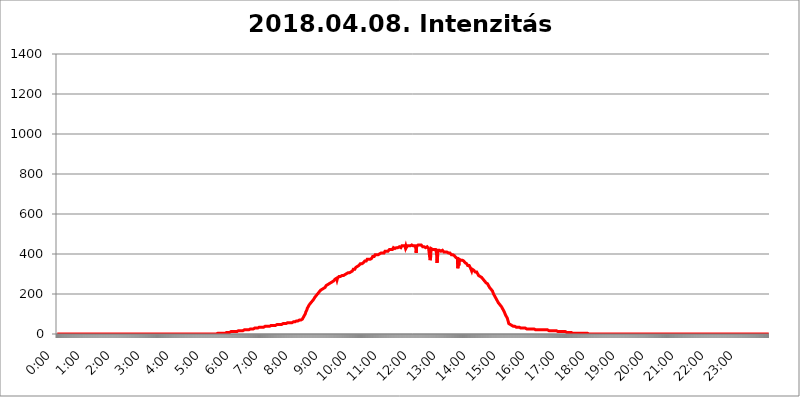
| Category | 2018.04.08. Intenzitás [W/m^2] |
|---|---|
| 0.0 | 0 |
| 0.0006944444444444445 | 0 |
| 0.001388888888888889 | 0 |
| 0.0020833333333333333 | 0 |
| 0.002777777777777778 | 0 |
| 0.003472222222222222 | 0 |
| 0.004166666666666667 | 0 |
| 0.004861111111111111 | 0 |
| 0.005555555555555556 | 0 |
| 0.0062499999999999995 | 0 |
| 0.006944444444444444 | 0 |
| 0.007638888888888889 | 0 |
| 0.008333333333333333 | 0 |
| 0.009027777777777779 | 0 |
| 0.009722222222222222 | 0 |
| 0.010416666666666666 | 0 |
| 0.011111111111111112 | 0 |
| 0.011805555555555555 | 0 |
| 0.012499999999999999 | 0 |
| 0.013194444444444444 | 0 |
| 0.013888888888888888 | 0 |
| 0.014583333333333332 | 0 |
| 0.015277777777777777 | 0 |
| 0.015972222222222224 | 0 |
| 0.016666666666666666 | 0 |
| 0.017361111111111112 | 0 |
| 0.018055555555555557 | 0 |
| 0.01875 | 0 |
| 0.019444444444444445 | 0 |
| 0.02013888888888889 | 0 |
| 0.020833333333333332 | 0 |
| 0.02152777777777778 | 0 |
| 0.022222222222222223 | 0 |
| 0.02291666666666667 | 0 |
| 0.02361111111111111 | 0 |
| 0.024305555555555556 | 0 |
| 0.024999999999999998 | 0 |
| 0.025694444444444447 | 0 |
| 0.02638888888888889 | 0 |
| 0.027083333333333334 | 0 |
| 0.027777777777777776 | 0 |
| 0.02847222222222222 | 0 |
| 0.029166666666666664 | 0 |
| 0.029861111111111113 | 0 |
| 0.030555555555555555 | 0 |
| 0.03125 | 0 |
| 0.03194444444444445 | 0 |
| 0.03263888888888889 | 0 |
| 0.03333333333333333 | 0 |
| 0.034027777777777775 | 0 |
| 0.034722222222222224 | 0 |
| 0.035416666666666666 | 0 |
| 0.036111111111111115 | 0 |
| 0.03680555555555556 | 0 |
| 0.0375 | 0 |
| 0.03819444444444444 | 0 |
| 0.03888888888888889 | 0 |
| 0.03958333333333333 | 0 |
| 0.04027777777777778 | 0 |
| 0.04097222222222222 | 0 |
| 0.041666666666666664 | 0 |
| 0.042361111111111106 | 0 |
| 0.04305555555555556 | 0 |
| 0.043750000000000004 | 0 |
| 0.044444444444444446 | 0 |
| 0.04513888888888889 | 0 |
| 0.04583333333333334 | 0 |
| 0.04652777777777778 | 0 |
| 0.04722222222222222 | 0 |
| 0.04791666666666666 | 0 |
| 0.04861111111111111 | 0 |
| 0.049305555555555554 | 0 |
| 0.049999999999999996 | 0 |
| 0.05069444444444445 | 0 |
| 0.051388888888888894 | 0 |
| 0.052083333333333336 | 0 |
| 0.05277777777777778 | 0 |
| 0.05347222222222222 | 0 |
| 0.05416666666666667 | 0 |
| 0.05486111111111111 | 0 |
| 0.05555555555555555 | 0 |
| 0.05625 | 0 |
| 0.05694444444444444 | 0 |
| 0.057638888888888885 | 0 |
| 0.05833333333333333 | 0 |
| 0.05902777777777778 | 0 |
| 0.059722222222222225 | 0 |
| 0.06041666666666667 | 0 |
| 0.061111111111111116 | 0 |
| 0.06180555555555556 | 0 |
| 0.0625 | 0 |
| 0.06319444444444444 | 0 |
| 0.06388888888888888 | 0 |
| 0.06458333333333334 | 0 |
| 0.06527777777777778 | 0 |
| 0.06597222222222222 | 0 |
| 0.06666666666666667 | 0 |
| 0.06736111111111111 | 0 |
| 0.06805555555555555 | 0 |
| 0.06874999999999999 | 0 |
| 0.06944444444444443 | 0 |
| 0.07013888888888889 | 0 |
| 0.07083333333333333 | 0 |
| 0.07152777777777779 | 0 |
| 0.07222222222222223 | 0 |
| 0.07291666666666667 | 0 |
| 0.07361111111111111 | 0 |
| 0.07430555555555556 | 0 |
| 0.075 | 0 |
| 0.07569444444444444 | 0 |
| 0.0763888888888889 | 0 |
| 0.07708333333333334 | 0 |
| 0.07777777777777778 | 0 |
| 0.07847222222222222 | 0 |
| 0.07916666666666666 | 0 |
| 0.0798611111111111 | 0 |
| 0.08055555555555556 | 0 |
| 0.08125 | 0 |
| 0.08194444444444444 | 0 |
| 0.08263888888888889 | 0 |
| 0.08333333333333333 | 0 |
| 0.08402777777777777 | 0 |
| 0.08472222222222221 | 0 |
| 0.08541666666666665 | 0 |
| 0.08611111111111112 | 0 |
| 0.08680555555555557 | 0 |
| 0.08750000000000001 | 0 |
| 0.08819444444444445 | 0 |
| 0.08888888888888889 | 0 |
| 0.08958333333333333 | 0 |
| 0.09027777777777778 | 0 |
| 0.09097222222222222 | 0 |
| 0.09166666666666667 | 0 |
| 0.09236111111111112 | 0 |
| 0.09305555555555556 | 0 |
| 0.09375 | 0 |
| 0.09444444444444444 | 0 |
| 0.09513888888888888 | 0 |
| 0.09583333333333333 | 0 |
| 0.09652777777777777 | 0 |
| 0.09722222222222222 | 0 |
| 0.09791666666666667 | 0 |
| 0.09861111111111111 | 0 |
| 0.09930555555555555 | 0 |
| 0.09999999999999999 | 0 |
| 0.10069444444444443 | 0 |
| 0.1013888888888889 | 0 |
| 0.10208333333333335 | 0 |
| 0.10277777777777779 | 0 |
| 0.10347222222222223 | 0 |
| 0.10416666666666667 | 0 |
| 0.10486111111111111 | 0 |
| 0.10555555555555556 | 0 |
| 0.10625 | 0 |
| 0.10694444444444444 | 0 |
| 0.1076388888888889 | 0 |
| 0.10833333333333334 | 0 |
| 0.10902777777777778 | 0 |
| 0.10972222222222222 | 0 |
| 0.1111111111111111 | 0 |
| 0.11180555555555556 | 0 |
| 0.11180555555555556 | 0 |
| 0.1125 | 0 |
| 0.11319444444444444 | 0 |
| 0.11388888888888889 | 0 |
| 0.11458333333333333 | 0 |
| 0.11527777777777777 | 0 |
| 0.11597222222222221 | 0 |
| 0.11666666666666665 | 0 |
| 0.1173611111111111 | 0 |
| 0.11805555555555557 | 0 |
| 0.11944444444444445 | 0 |
| 0.12013888888888889 | 0 |
| 0.12083333333333333 | 0 |
| 0.12152777777777778 | 0 |
| 0.12222222222222223 | 0 |
| 0.12291666666666667 | 0 |
| 0.12291666666666667 | 0 |
| 0.12361111111111112 | 0 |
| 0.12430555555555556 | 0 |
| 0.125 | 0 |
| 0.12569444444444444 | 0 |
| 0.12638888888888888 | 0 |
| 0.12708333333333333 | 0 |
| 0.16875 | 0 |
| 0.12847222222222224 | 0 |
| 0.12916666666666668 | 0 |
| 0.12986111111111112 | 0 |
| 0.13055555555555556 | 0 |
| 0.13125 | 0 |
| 0.13194444444444445 | 0 |
| 0.1326388888888889 | 0 |
| 0.13333333333333333 | 0 |
| 0.13402777777777777 | 0 |
| 0.13402777777777777 | 0 |
| 0.13472222222222222 | 0 |
| 0.13541666666666666 | 0 |
| 0.1361111111111111 | 0 |
| 0.13749999999999998 | 0 |
| 0.13819444444444443 | 0 |
| 0.1388888888888889 | 0 |
| 0.13958333333333334 | 0 |
| 0.14027777777777778 | 0 |
| 0.14097222222222222 | 0 |
| 0.14166666666666666 | 0 |
| 0.1423611111111111 | 0 |
| 0.14305555555555557 | 0 |
| 0.14375000000000002 | 0 |
| 0.14444444444444446 | 0 |
| 0.1451388888888889 | 0 |
| 0.1451388888888889 | 0 |
| 0.14652777777777778 | 0 |
| 0.14722222222222223 | 0 |
| 0.14791666666666667 | 0 |
| 0.1486111111111111 | 0 |
| 0.14930555555555555 | 0 |
| 0.15 | 0 |
| 0.15069444444444444 | 0 |
| 0.15138888888888888 | 0 |
| 0.15208333333333332 | 0 |
| 0.15277777777777776 | 0 |
| 0.15347222222222223 | 0 |
| 0.15416666666666667 | 0 |
| 0.15486111111111112 | 0 |
| 0.15555555555555556 | 0 |
| 0.15625 | 0 |
| 0.15694444444444444 | 0 |
| 0.15763888888888888 | 0 |
| 0.15833333333333333 | 0 |
| 0.15902777777777777 | 0 |
| 0.15972222222222224 | 0 |
| 0.16041666666666668 | 0 |
| 0.16111111111111112 | 0 |
| 0.16180555555555556 | 0 |
| 0.1625 | 0 |
| 0.16319444444444445 | 0 |
| 0.1638888888888889 | 0 |
| 0.16458333333333333 | 0 |
| 0.16527777777777777 | 0 |
| 0.16597222222222222 | 0 |
| 0.16666666666666666 | 0 |
| 0.1673611111111111 | 0 |
| 0.16805555555555554 | 0 |
| 0.16874999999999998 | 0 |
| 0.16944444444444443 | 0 |
| 0.17013888888888887 | 0 |
| 0.1708333333333333 | 0 |
| 0.17152777777777775 | 0 |
| 0.17222222222222225 | 0 |
| 0.1729166666666667 | 0 |
| 0.17361111111111113 | 0 |
| 0.17430555555555557 | 0 |
| 0.17500000000000002 | 0 |
| 0.17569444444444446 | 0 |
| 0.1763888888888889 | 0 |
| 0.17708333333333334 | 0 |
| 0.17777777777777778 | 0 |
| 0.17847222222222223 | 0 |
| 0.17916666666666667 | 0 |
| 0.1798611111111111 | 0 |
| 0.18055555555555555 | 0 |
| 0.18125 | 0 |
| 0.18194444444444444 | 0 |
| 0.1826388888888889 | 0 |
| 0.18333333333333335 | 0 |
| 0.1840277777777778 | 0 |
| 0.18472222222222223 | 0 |
| 0.18541666666666667 | 0 |
| 0.18611111111111112 | 0 |
| 0.18680555555555556 | 0 |
| 0.1875 | 0 |
| 0.18819444444444444 | 0 |
| 0.18888888888888888 | 0 |
| 0.18958333333333333 | 0 |
| 0.19027777777777777 | 0 |
| 0.1909722222222222 | 0 |
| 0.19166666666666665 | 0 |
| 0.19236111111111112 | 0 |
| 0.19305555555555554 | 0 |
| 0.19375 | 0 |
| 0.19444444444444445 | 0 |
| 0.1951388888888889 | 0 |
| 0.19583333333333333 | 0 |
| 0.19652777777777777 | 0 |
| 0.19722222222222222 | 0 |
| 0.19791666666666666 | 0 |
| 0.1986111111111111 | 0 |
| 0.19930555555555554 | 0 |
| 0.19999999999999998 | 0 |
| 0.20069444444444443 | 0 |
| 0.20138888888888887 | 0 |
| 0.2020833333333333 | 0 |
| 0.2027777777777778 | 0 |
| 0.2034722222222222 | 0 |
| 0.2041666666666667 | 0 |
| 0.20486111111111113 | 0 |
| 0.20555555555555557 | 0 |
| 0.20625000000000002 | 0 |
| 0.20694444444444446 | 0 |
| 0.2076388888888889 | 0 |
| 0.20833333333333334 | 0 |
| 0.20902777777777778 | 0 |
| 0.20972222222222223 | 0 |
| 0.21041666666666667 | 0 |
| 0.2111111111111111 | 0 |
| 0.21180555555555555 | 0 |
| 0.2125 | 0 |
| 0.21319444444444444 | 0 |
| 0.2138888888888889 | 0 |
| 0.21458333333333335 | 0 |
| 0.2152777777777778 | 0 |
| 0.21597222222222223 | 0 |
| 0.21666666666666667 | 0 |
| 0.21736111111111112 | 0 |
| 0.21805555555555556 | 0 |
| 0.21875 | 0 |
| 0.21944444444444444 | 0 |
| 0.22013888888888888 | 0 |
| 0.22083333333333333 | 0 |
| 0.22152777777777777 | 0 |
| 0.2222222222222222 | 0 |
| 0.22291666666666665 | 0 |
| 0.2236111111111111 | 0 |
| 0.22430555555555556 | 3.525 |
| 0.225 | 3.525 |
| 0.22569444444444445 | 3.525 |
| 0.2263888888888889 | 3.525 |
| 0.22708333333333333 | 3.525 |
| 0.22777777777777777 | 3.525 |
| 0.22847222222222222 | 3.525 |
| 0.22916666666666666 | 3.525 |
| 0.2298611111111111 | 3.525 |
| 0.23055555555555554 | 3.525 |
| 0.23124999999999998 | 3.525 |
| 0.23194444444444443 | 3.525 |
| 0.23263888888888887 | 3.525 |
| 0.2333333333333333 | 3.525 |
| 0.2340277777777778 | 3.525 |
| 0.2347222222222222 | 3.525 |
| 0.2354166666666667 | 3.525 |
| 0.23611111111111113 | 3.525 |
| 0.23680555555555557 | 7.887 |
| 0.23750000000000002 | 7.887 |
| 0.23819444444444446 | 7.887 |
| 0.2388888888888889 | 7.887 |
| 0.23958333333333334 | 7.887 |
| 0.24027777777777778 | 7.887 |
| 0.24097222222222223 | 7.887 |
| 0.24166666666666667 | 7.887 |
| 0.2423611111111111 | 7.887 |
| 0.24305555555555555 | 7.887 |
| 0.24375 | 12.257 |
| 0.24444444444444446 | 12.257 |
| 0.24513888888888888 | 12.257 |
| 0.24583333333333335 | 12.257 |
| 0.2465277777777778 | 12.257 |
| 0.24722222222222223 | 12.257 |
| 0.24791666666666667 | 12.257 |
| 0.24861111111111112 | 12.257 |
| 0.24930555555555556 | 12.257 |
| 0.25 | 12.257 |
| 0.25069444444444444 | 12.257 |
| 0.2513888888888889 | 12.257 |
| 0.2520833333333333 | 12.257 |
| 0.25277777777777777 | 12.257 |
| 0.2534722222222222 | 12.257 |
| 0.25416666666666665 | 16.636 |
| 0.2548611111111111 | 16.636 |
| 0.2555555555555556 | 16.636 |
| 0.25625000000000003 | 16.636 |
| 0.2569444444444445 | 16.636 |
| 0.2576388888888889 | 16.636 |
| 0.25833333333333336 | 16.636 |
| 0.2590277777777778 | 16.636 |
| 0.25972222222222224 | 16.636 |
| 0.2604166666666667 | 16.636 |
| 0.2611111111111111 | 21.024 |
| 0.26180555555555557 | 21.024 |
| 0.2625 | 21.024 |
| 0.26319444444444445 | 21.024 |
| 0.2638888888888889 | 21.024 |
| 0.26458333333333334 | 21.024 |
| 0.2652777777777778 | 21.024 |
| 0.2659722222222222 | 21.024 |
| 0.26666666666666666 | 21.024 |
| 0.2673611111111111 | 21.024 |
| 0.26805555555555555 | 21.024 |
| 0.26875 | 21.024 |
| 0.26944444444444443 | 25.419 |
| 0.2701388888888889 | 25.419 |
| 0.2708333333333333 | 25.419 |
| 0.27152777777777776 | 25.419 |
| 0.2722222222222222 | 25.419 |
| 0.27291666666666664 | 25.419 |
| 0.2736111111111111 | 25.419 |
| 0.2743055555555555 | 25.419 |
| 0.27499999999999997 | 25.419 |
| 0.27569444444444446 | 29.823 |
| 0.27638888888888885 | 25.419 |
| 0.27708333333333335 | 29.823 |
| 0.2777777777777778 | 29.823 |
| 0.27847222222222223 | 29.823 |
| 0.2791666666666667 | 29.823 |
| 0.2798611111111111 | 29.823 |
| 0.28055555555555556 | 29.823 |
| 0.28125 | 29.823 |
| 0.28194444444444444 | 29.823 |
| 0.2826388888888889 | 29.823 |
| 0.2833333333333333 | 34.234 |
| 0.28402777777777777 | 29.823 |
| 0.2847222222222222 | 34.234 |
| 0.28541666666666665 | 34.234 |
| 0.28611111111111115 | 34.234 |
| 0.28680555555555554 | 34.234 |
| 0.28750000000000003 | 34.234 |
| 0.2881944444444445 | 34.234 |
| 0.2888888888888889 | 34.234 |
| 0.28958333333333336 | 34.234 |
| 0.2902777777777778 | 34.234 |
| 0.29097222222222224 | 38.653 |
| 0.2916666666666667 | 38.653 |
| 0.2923611111111111 | 38.653 |
| 0.29305555555555557 | 38.653 |
| 0.29375 | 38.653 |
| 0.29444444444444445 | 38.653 |
| 0.2951388888888889 | 38.653 |
| 0.29583333333333334 | 38.653 |
| 0.2965277777777778 | 38.653 |
| 0.2972222222222222 | 38.653 |
| 0.29791666666666666 | 38.653 |
| 0.2986111111111111 | 38.653 |
| 0.29930555555555555 | 43.079 |
| 0.3 | 43.079 |
| 0.30069444444444443 | 43.079 |
| 0.3013888888888889 | 43.079 |
| 0.3020833333333333 | 43.079 |
| 0.30277777777777776 | 43.079 |
| 0.3034722222222222 | 43.079 |
| 0.30416666666666664 | 43.079 |
| 0.3048611111111111 | 43.079 |
| 0.3055555555555555 | 43.079 |
| 0.30624999999999997 | 43.079 |
| 0.3069444444444444 | 47.511 |
| 0.3076388888888889 | 47.511 |
| 0.30833333333333335 | 47.511 |
| 0.3090277777777778 | 47.511 |
| 0.30972222222222223 | 47.511 |
| 0.3104166666666667 | 47.511 |
| 0.3111111111111111 | 47.511 |
| 0.31180555555555556 | 47.511 |
| 0.3125 | 47.511 |
| 0.31319444444444444 | 47.511 |
| 0.3138888888888889 | 47.511 |
| 0.3145833333333333 | 47.511 |
| 0.31527777777777777 | 47.511 |
| 0.3159722222222222 | 47.511 |
| 0.31666666666666665 | 51.951 |
| 0.31736111111111115 | 51.951 |
| 0.31805555555555554 | 51.951 |
| 0.31875000000000003 | 51.951 |
| 0.3194444444444445 | 51.951 |
| 0.3201388888888889 | 51.951 |
| 0.32083333333333336 | 51.951 |
| 0.3215277777777778 | 51.951 |
| 0.32222222222222224 | 51.951 |
| 0.3229166666666667 | 56.398 |
| 0.3236111111111111 | 56.398 |
| 0.32430555555555557 | 56.398 |
| 0.325 | 56.398 |
| 0.32569444444444445 | 56.398 |
| 0.3263888888888889 | 56.398 |
| 0.32708333333333334 | 56.398 |
| 0.3277777777777778 | 56.398 |
| 0.3284722222222222 | 56.398 |
| 0.32916666666666666 | 56.398 |
| 0.3298611111111111 | 56.398 |
| 0.33055555555555555 | 60.85 |
| 0.33125 | 60.85 |
| 0.33194444444444443 | 60.85 |
| 0.3326388888888889 | 60.85 |
| 0.3333333333333333 | 60.85 |
| 0.3340277777777778 | 60.85 |
| 0.3347222222222222 | 60.85 |
| 0.3354166666666667 | 65.31 |
| 0.3361111111111111 | 65.31 |
| 0.3368055555555556 | 65.31 |
| 0.33749999999999997 | 65.31 |
| 0.33819444444444446 | 65.31 |
| 0.33888888888888885 | 65.31 |
| 0.33958333333333335 | 69.775 |
| 0.34027777777777773 | 69.775 |
| 0.34097222222222223 | 69.775 |
| 0.3416666666666666 | 69.775 |
| 0.3423611111111111 | 74.246 |
| 0.3430555555555555 | 74.246 |
| 0.34375 | 74.246 |
| 0.3444444444444445 | 78.722 |
| 0.3451388888888889 | 83.205 |
| 0.3458333333333334 | 87.692 |
| 0.34652777777777777 | 92.184 |
| 0.34722222222222227 | 96.682 |
| 0.34791666666666665 | 101.184 |
| 0.34861111111111115 | 110.201 |
| 0.34930555555555554 | 114.716 |
| 0.35000000000000003 | 119.235 |
| 0.3506944444444444 | 128.284 |
| 0.3513888888888889 | 132.814 |
| 0.3520833333333333 | 137.347 |
| 0.3527777777777778 | 141.884 |
| 0.3534722222222222 | 146.423 |
| 0.3541666666666667 | 150.964 |
| 0.3548611111111111 | 150.964 |
| 0.35555555555555557 | 155.509 |
| 0.35625 | 155.509 |
| 0.35694444444444445 | 160.056 |
| 0.3576388888888889 | 164.605 |
| 0.35833333333333334 | 164.605 |
| 0.3590277777777778 | 169.156 |
| 0.3597222222222222 | 173.709 |
| 0.36041666666666666 | 178.264 |
| 0.3611111111111111 | 182.82 |
| 0.36180555555555555 | 182.82 |
| 0.3625 | 187.378 |
| 0.36319444444444443 | 191.937 |
| 0.3638888888888889 | 196.497 |
| 0.3645833333333333 | 196.497 |
| 0.3652777777777778 | 201.058 |
| 0.3659722222222222 | 201.058 |
| 0.3666666666666667 | 205.62 |
| 0.3673611111111111 | 210.182 |
| 0.3680555555555556 | 214.746 |
| 0.36874999999999997 | 214.746 |
| 0.36944444444444446 | 219.309 |
| 0.37013888888888885 | 219.309 |
| 0.37083333333333335 | 219.309 |
| 0.37152777777777773 | 223.873 |
| 0.37222222222222223 | 228.436 |
| 0.3729166666666666 | 228.436 |
| 0.3736111111111111 | 228.436 |
| 0.3743055555555555 | 233 |
| 0.375 | 233 |
| 0.3756944444444445 | 233 |
| 0.3763888888888889 | 237.564 |
| 0.3770833333333334 | 242.127 |
| 0.37777777777777777 | 242.127 |
| 0.37847222222222227 | 242.127 |
| 0.37916666666666665 | 246.689 |
| 0.37986111111111115 | 246.689 |
| 0.38055555555555554 | 251.251 |
| 0.38125000000000003 | 251.251 |
| 0.3819444444444444 | 251.251 |
| 0.3826388888888889 | 251.251 |
| 0.3833333333333333 | 255.813 |
| 0.3840277777777778 | 260.373 |
| 0.3847222222222222 | 260.373 |
| 0.3854166666666667 | 260.373 |
| 0.3861111111111111 | 260.373 |
| 0.38680555555555557 | 264.932 |
| 0.3875 | 264.932 |
| 0.38819444444444445 | 269.49 |
| 0.3888888888888889 | 269.49 |
| 0.38958333333333334 | 274.047 |
| 0.3902777777777778 | 274.047 |
| 0.3909722222222222 | 274.047 |
| 0.39166666666666666 | 278.603 |
| 0.3923611111111111 | 269.49 |
| 0.39305555555555555 | 278.603 |
| 0.39375 | 283.156 |
| 0.39444444444444443 | 278.603 |
| 0.3951388888888889 | 287.709 |
| 0.3958333333333333 | 283.156 |
| 0.3965277777777778 | 283.156 |
| 0.3972222222222222 | 287.709 |
| 0.3979166666666667 | 287.709 |
| 0.3986111111111111 | 287.709 |
| 0.3993055555555556 | 292.259 |
| 0.39999999999999997 | 287.709 |
| 0.40069444444444446 | 292.259 |
| 0.40138888888888885 | 292.259 |
| 0.40208333333333335 | 296.808 |
| 0.40277777777777773 | 296.808 |
| 0.40347222222222223 | 296.808 |
| 0.4041666666666666 | 301.354 |
| 0.4048611111111111 | 301.354 |
| 0.4055555555555555 | 301.354 |
| 0.40625 | 305.898 |
| 0.4069444444444445 | 301.354 |
| 0.4076388888888889 | 305.898 |
| 0.4083333333333334 | 310.44 |
| 0.40902777777777777 | 305.898 |
| 0.40972222222222227 | 305.898 |
| 0.41041666666666665 | 310.44 |
| 0.41111111111111115 | 310.44 |
| 0.41180555555555554 | 310.44 |
| 0.41250000000000003 | 310.44 |
| 0.4131944444444444 | 314.98 |
| 0.4138888888888889 | 314.98 |
| 0.4145833333333333 | 314.98 |
| 0.4152777777777778 | 324.052 |
| 0.4159722222222222 | 324.052 |
| 0.4166666666666667 | 324.052 |
| 0.4173611111111111 | 324.052 |
| 0.41805555555555557 | 324.052 |
| 0.41875 | 333.113 |
| 0.41944444444444445 | 333.113 |
| 0.4201388888888889 | 333.113 |
| 0.42083333333333334 | 337.639 |
| 0.4215277777777778 | 333.113 |
| 0.4222222222222222 | 342.162 |
| 0.42291666666666666 | 342.162 |
| 0.4236111111111111 | 346.682 |
| 0.42430555555555555 | 346.682 |
| 0.425 | 351.198 |
| 0.42569444444444443 | 351.198 |
| 0.4263888888888889 | 351.198 |
| 0.4270833333333333 | 351.198 |
| 0.4277777777777778 | 355.712 |
| 0.4284722222222222 | 351.198 |
| 0.4291666666666667 | 355.712 |
| 0.4298611111111111 | 360.221 |
| 0.4305555555555556 | 360.221 |
| 0.43124999999999997 | 364.728 |
| 0.43194444444444446 | 364.728 |
| 0.43263888888888885 | 364.728 |
| 0.43333333333333335 | 364.728 |
| 0.43402777777777773 | 364.728 |
| 0.43472222222222223 | 373.729 |
| 0.4354166666666666 | 369.23 |
| 0.4361111111111111 | 373.729 |
| 0.4368055555555555 | 373.729 |
| 0.4375 | 373.729 |
| 0.4381944444444445 | 369.23 |
| 0.4388888888888889 | 373.729 |
| 0.4395833333333334 | 378.224 |
| 0.44027777777777777 | 378.224 |
| 0.44097222222222227 | 378.224 |
| 0.44166666666666665 | 382.715 |
| 0.44236111111111115 | 387.202 |
| 0.44305555555555554 | 387.202 |
| 0.44375000000000003 | 387.202 |
| 0.4444444444444444 | 387.202 |
| 0.4451388888888889 | 391.685 |
| 0.4458333333333333 | 396.164 |
| 0.4465277777777778 | 396.164 |
| 0.4472222222222222 | 396.164 |
| 0.4479166666666667 | 396.164 |
| 0.4486111111111111 | 396.164 |
| 0.44930555555555557 | 396.164 |
| 0.45 | 396.164 |
| 0.45069444444444445 | 396.164 |
| 0.4513888888888889 | 396.164 |
| 0.45208333333333334 | 400.638 |
| 0.4527777777777778 | 396.164 |
| 0.4534722222222222 | 400.638 |
| 0.45416666666666666 | 405.108 |
| 0.4548611111111111 | 405.108 |
| 0.45555555555555555 | 405.108 |
| 0.45625 | 405.108 |
| 0.45694444444444443 | 405.108 |
| 0.4576388888888889 | 409.574 |
| 0.4583333333333333 | 405.108 |
| 0.4590277777777778 | 409.574 |
| 0.4597222222222222 | 414.035 |
| 0.4604166666666667 | 414.035 |
| 0.4611111111111111 | 414.035 |
| 0.4618055555555556 | 414.035 |
| 0.46249999999999997 | 418.492 |
| 0.46319444444444446 | 418.492 |
| 0.46388888888888885 | 414.035 |
| 0.46458333333333335 | 418.492 |
| 0.46527777777777773 | 409.574 |
| 0.46597222222222223 | 422.943 |
| 0.4666666666666666 | 422.943 |
| 0.4673611111111111 | 422.943 |
| 0.4680555555555555 | 422.943 |
| 0.46875 | 422.943 |
| 0.4694444444444445 | 422.943 |
| 0.4701388888888889 | 422.943 |
| 0.4708333333333334 | 422.943 |
| 0.47152777777777777 | 431.833 |
| 0.47222222222222227 | 427.39 |
| 0.47291666666666665 | 427.39 |
| 0.47361111111111115 | 427.39 |
| 0.47430555555555554 | 431.833 |
| 0.47500000000000003 | 431.833 |
| 0.4756944444444444 | 431.833 |
| 0.4763888888888889 | 436.27 |
| 0.4770833333333333 | 431.833 |
| 0.4777777777777778 | 431.833 |
| 0.4784722222222222 | 431.833 |
| 0.4791666666666667 | 431.833 |
| 0.4798611111111111 | 436.27 |
| 0.48055555555555557 | 436.27 |
| 0.48125 | 436.27 |
| 0.48194444444444445 | 431.833 |
| 0.4826388888888889 | 436.27 |
| 0.48333333333333334 | 440.702 |
| 0.4840277777777778 | 440.702 |
| 0.4847222222222222 | 440.702 |
| 0.48541666666666666 | 440.702 |
| 0.4861111111111111 | 440.702 |
| 0.48680555555555555 | 440.702 |
| 0.4875 | 440.702 |
| 0.48819444444444443 | 431.833 |
| 0.4888888888888889 | 440.702 |
| 0.4895833333333333 | 431.833 |
| 0.4902777777777778 | 436.27 |
| 0.4909722222222222 | 440.702 |
| 0.4916666666666667 | 440.702 |
| 0.4923611111111111 | 436.27 |
| 0.4930555555555556 | 440.702 |
| 0.49374999999999997 | 445.129 |
| 0.49444444444444446 | 440.702 |
| 0.49513888888888885 | 440.702 |
| 0.49583333333333335 | 440.702 |
| 0.49652777777777773 | 440.702 |
| 0.49722222222222223 | 445.129 |
| 0.4979166666666666 | 445.129 |
| 0.4986111111111111 | 440.702 |
| 0.4993055555555555 | 440.702 |
| 0.5 | 445.129 |
| 0.5006944444444444 | 436.27 |
| 0.5013888888888889 | 440.702 |
| 0.5020833333333333 | 445.129 |
| 0.5027777777777778 | 431.833 |
| 0.5034722222222222 | 405.108 |
| 0.5041666666666667 | 440.702 |
| 0.5048611111111111 | 440.702 |
| 0.5055555555555555 | 440.702 |
| 0.50625 | 445.129 |
| 0.5069444444444444 | 440.702 |
| 0.5076388888888889 | 445.129 |
| 0.5083333333333333 | 445.129 |
| 0.5090277777777777 | 440.702 |
| 0.5097222222222222 | 445.129 |
| 0.5104166666666666 | 445.129 |
| 0.5111111111111112 | 440.702 |
| 0.5118055555555555 | 440.702 |
| 0.5125000000000001 | 436.27 |
| 0.5131944444444444 | 431.833 |
| 0.513888888888889 | 436.27 |
| 0.5145833333333333 | 436.27 |
| 0.5152777777777778 | 440.702 |
| 0.5159722222222222 | 436.27 |
| 0.5166666666666667 | 431.833 |
| 0.517361111111111 | 431.833 |
| 0.5180555555555556 | 436.27 |
| 0.5187499999999999 | 436.27 |
| 0.5194444444444445 | 431.833 |
| 0.5201388888888888 | 431.833 |
| 0.5208333333333334 | 427.39 |
| 0.5215277777777778 | 422.943 |
| 0.5222222222222223 | 422.943 |
| 0.5229166666666667 | 369.23 |
| 0.5236111111111111 | 378.224 |
| 0.5243055555555556 | 427.39 |
| 0.525 | 427.39 |
| 0.5256944444444445 | 427.39 |
| 0.5263888888888889 | 422.943 |
| 0.5270833333333333 | 427.39 |
| 0.5277777777777778 | 427.39 |
| 0.5284722222222222 | 422.943 |
| 0.5291666666666667 | 427.39 |
| 0.5298611111111111 | 422.943 |
| 0.5305555555555556 | 422.943 |
| 0.53125 | 418.492 |
| 0.5319444444444444 | 405.108 |
| 0.5326388888888889 | 355.712 |
| 0.5333333333333333 | 378.224 |
| 0.5340277777777778 | 418.492 |
| 0.5347222222222222 | 418.492 |
| 0.5354166666666667 | 418.492 |
| 0.5361111111111111 | 418.492 |
| 0.5368055555555555 | 414.035 |
| 0.5375 | 418.492 |
| 0.5381944444444444 | 414.035 |
| 0.5388888888888889 | 414.035 |
| 0.5395833333333333 | 414.035 |
| 0.5402777777777777 | 418.492 |
| 0.5409722222222222 | 414.035 |
| 0.5416666666666666 | 414.035 |
| 0.5423611111111112 | 409.574 |
| 0.5430555555555555 | 414.035 |
| 0.5437500000000001 | 409.574 |
| 0.5444444444444444 | 409.574 |
| 0.545138888888889 | 405.108 |
| 0.5458333333333333 | 405.108 |
| 0.5465277777777778 | 409.574 |
| 0.5472222222222222 | 409.574 |
| 0.5479166666666667 | 409.574 |
| 0.548611111111111 | 405.108 |
| 0.5493055555555556 | 409.574 |
| 0.5499999999999999 | 405.108 |
| 0.5506944444444445 | 405.108 |
| 0.5513888888888888 | 400.638 |
| 0.5520833333333334 | 400.638 |
| 0.5527777777777778 | 396.164 |
| 0.5534722222222223 | 396.164 |
| 0.5541666666666667 | 396.164 |
| 0.5548611111111111 | 396.164 |
| 0.5555555555555556 | 396.164 |
| 0.55625 | 391.685 |
| 0.5569444444444445 | 391.685 |
| 0.5576388888888889 | 387.202 |
| 0.5583333333333333 | 387.202 |
| 0.5590277777777778 | 382.715 |
| 0.5597222222222222 | 382.715 |
| 0.5604166666666667 | 382.715 |
| 0.5611111111111111 | 378.224 |
| 0.5618055555555556 | 328.584 |
| 0.5625 | 351.198 |
| 0.5631944444444444 | 342.162 |
| 0.5638888888888889 | 373.729 |
| 0.5645833333333333 | 373.729 |
| 0.5652777777777778 | 369.23 |
| 0.5659722222222222 | 369.23 |
| 0.5666666666666667 | 369.23 |
| 0.5673611111111111 | 373.729 |
| 0.5680555555555555 | 369.23 |
| 0.56875 | 364.728 |
| 0.5694444444444444 | 369.23 |
| 0.5701388888888889 | 364.728 |
| 0.5708333333333333 | 360.221 |
| 0.5715277777777777 | 360.221 |
| 0.5722222222222222 | 355.712 |
| 0.5729166666666666 | 355.712 |
| 0.5736111111111112 | 351.198 |
| 0.5743055555555555 | 351.198 |
| 0.5750000000000001 | 346.682 |
| 0.5756944444444444 | 342.162 |
| 0.576388888888889 | 342.162 |
| 0.5770833333333333 | 342.162 |
| 0.5777777777777778 | 342.162 |
| 0.5784722222222222 | 337.639 |
| 0.5791666666666667 | 333.113 |
| 0.579861111111111 | 328.584 |
| 0.5805555555555556 | 333.113 |
| 0.5812499999999999 | 314.98 |
| 0.5819444444444445 | 324.052 |
| 0.5826388888888888 | 324.052 |
| 0.5833333333333334 | 324.052 |
| 0.5840277777777778 | 319.517 |
| 0.5847222222222223 | 314.98 |
| 0.5854166666666667 | 314.98 |
| 0.5861111111111111 | 310.44 |
| 0.5868055555555556 | 310.44 |
| 0.5875 | 310.44 |
| 0.5881944444444445 | 310.44 |
| 0.5888888888888889 | 305.898 |
| 0.5895833333333333 | 301.354 |
| 0.5902777777777778 | 301.354 |
| 0.5909722222222222 | 292.259 |
| 0.5916666666666667 | 292.259 |
| 0.5923611111111111 | 287.709 |
| 0.5930555555555556 | 287.709 |
| 0.59375 | 287.709 |
| 0.5944444444444444 | 287.709 |
| 0.5951388888888889 | 283.156 |
| 0.5958333333333333 | 283.156 |
| 0.5965277777777778 | 278.603 |
| 0.5972222222222222 | 274.047 |
| 0.5979166666666667 | 274.047 |
| 0.5986111111111111 | 269.49 |
| 0.5993055555555555 | 264.932 |
| 0.6 | 264.932 |
| 0.6006944444444444 | 260.373 |
| 0.6013888888888889 | 255.813 |
| 0.6020833333333333 | 255.813 |
| 0.6027777777777777 | 251.251 |
| 0.6034722222222222 | 251.251 |
| 0.6041666666666666 | 246.689 |
| 0.6048611111111112 | 242.127 |
| 0.6055555555555555 | 237.564 |
| 0.6062500000000001 | 233 |
| 0.6069444444444444 | 228.436 |
| 0.607638888888889 | 228.436 |
| 0.6083333333333333 | 223.873 |
| 0.6090277777777778 | 219.309 |
| 0.6097222222222222 | 219.309 |
| 0.6104166666666667 | 214.746 |
| 0.611111111111111 | 210.182 |
| 0.6118055555555556 | 201.058 |
| 0.6124999999999999 | 196.497 |
| 0.6131944444444445 | 191.937 |
| 0.6138888888888888 | 187.378 |
| 0.6145833333333334 | 182.82 |
| 0.6152777777777778 | 178.264 |
| 0.6159722222222223 | 173.709 |
| 0.6166666666666667 | 169.156 |
| 0.6173611111111111 | 164.605 |
| 0.6180555555555556 | 160.056 |
| 0.61875 | 155.509 |
| 0.6194444444444445 | 155.509 |
| 0.6201388888888889 | 150.964 |
| 0.6208333333333333 | 146.423 |
| 0.6215277777777778 | 146.423 |
| 0.6222222222222222 | 141.884 |
| 0.6229166666666667 | 137.347 |
| 0.6236111111111111 | 132.814 |
| 0.6243055555555556 | 128.284 |
| 0.625 | 123.758 |
| 0.6256944444444444 | 119.235 |
| 0.6263888888888889 | 114.716 |
| 0.6270833333333333 | 110.201 |
| 0.6277777777777778 | 105.69 |
| 0.6284722222222222 | 96.682 |
| 0.6291666666666667 | 92.184 |
| 0.6298611111111111 | 87.692 |
| 0.6305555555555555 | 83.205 |
| 0.63125 | 78.722 |
| 0.6319444444444444 | 69.775 |
| 0.6326388888888889 | 60.85 |
| 0.6333333333333333 | 51.951 |
| 0.6340277777777777 | 47.511 |
| 0.6347222222222222 | 47.511 |
| 0.6354166666666666 | 47.511 |
| 0.6361111111111112 | 43.079 |
| 0.6368055555555555 | 43.079 |
| 0.6375000000000001 | 43.079 |
| 0.6381944444444444 | 43.079 |
| 0.638888888888889 | 38.653 |
| 0.6395833333333333 | 38.653 |
| 0.6402777777777778 | 38.653 |
| 0.6409722222222222 | 38.653 |
| 0.6416666666666667 | 38.653 |
| 0.642361111111111 | 38.653 |
| 0.6430555555555556 | 38.653 |
| 0.6437499999999999 | 34.234 |
| 0.6444444444444445 | 34.234 |
| 0.6451388888888888 | 34.234 |
| 0.6458333333333334 | 34.234 |
| 0.6465277777777778 | 34.234 |
| 0.6472222222222223 | 34.234 |
| 0.6479166666666667 | 34.234 |
| 0.6486111111111111 | 29.823 |
| 0.6493055555555556 | 29.823 |
| 0.65 | 29.823 |
| 0.6506944444444445 | 29.823 |
| 0.6513888888888889 | 29.823 |
| 0.6520833333333333 | 29.823 |
| 0.6527777777777778 | 29.823 |
| 0.6534722222222222 | 29.823 |
| 0.6541666666666667 | 29.823 |
| 0.6548611111111111 | 29.823 |
| 0.6555555555555556 | 29.823 |
| 0.65625 | 29.823 |
| 0.6569444444444444 | 25.419 |
| 0.6576388888888889 | 25.419 |
| 0.6583333333333333 | 25.419 |
| 0.6590277777777778 | 25.419 |
| 0.6597222222222222 | 25.419 |
| 0.6604166666666667 | 25.419 |
| 0.6611111111111111 | 25.419 |
| 0.6618055555555555 | 25.419 |
| 0.6625 | 25.419 |
| 0.6631944444444444 | 25.419 |
| 0.6638888888888889 | 25.419 |
| 0.6645833333333333 | 25.419 |
| 0.6652777777777777 | 25.419 |
| 0.6659722222222222 | 25.419 |
| 0.6666666666666666 | 25.419 |
| 0.6673611111111111 | 25.419 |
| 0.6680555555555556 | 25.419 |
| 0.6687500000000001 | 25.419 |
| 0.6694444444444444 | 25.419 |
| 0.6701388888888888 | 21.024 |
| 0.6708333333333334 | 21.024 |
| 0.6715277777777778 | 21.024 |
| 0.6722222222222222 | 21.024 |
| 0.6729166666666666 | 21.024 |
| 0.6736111111111112 | 21.024 |
| 0.6743055555555556 | 21.024 |
| 0.6749999999999999 | 21.024 |
| 0.6756944444444444 | 21.024 |
| 0.6763888888888889 | 21.024 |
| 0.6770833333333334 | 21.024 |
| 0.6777777777777777 | 21.024 |
| 0.6784722222222223 | 21.024 |
| 0.6791666666666667 | 21.024 |
| 0.6798611111111111 | 21.024 |
| 0.6805555555555555 | 21.024 |
| 0.68125 | 21.024 |
| 0.6819444444444445 | 21.024 |
| 0.6826388888888889 | 21.024 |
| 0.6833333333333332 | 21.024 |
| 0.6840277777777778 | 21.024 |
| 0.6847222222222222 | 21.024 |
| 0.6854166666666667 | 21.024 |
| 0.686111111111111 | 16.636 |
| 0.6868055555555556 | 16.636 |
| 0.6875 | 21.024 |
| 0.6881944444444444 | 16.636 |
| 0.688888888888889 | 16.636 |
| 0.6895833333333333 | 16.636 |
| 0.6902777777777778 | 16.636 |
| 0.6909722222222222 | 16.636 |
| 0.6916666666666668 | 16.636 |
| 0.6923611111111111 | 16.636 |
| 0.6930555555555555 | 16.636 |
| 0.69375 | 16.636 |
| 0.6944444444444445 | 16.636 |
| 0.6951388888888889 | 16.636 |
| 0.6958333333333333 | 16.636 |
| 0.6965277777777777 | 16.636 |
| 0.6972222222222223 | 16.636 |
| 0.6979166666666666 | 16.636 |
| 0.6986111111111111 | 16.636 |
| 0.6993055555555556 | 16.636 |
| 0.7000000000000001 | 16.636 |
| 0.7006944444444444 | 12.257 |
| 0.7013888888888888 | 12.257 |
| 0.7020833333333334 | 12.257 |
| 0.7027777777777778 | 12.257 |
| 0.7034722222222222 | 12.257 |
| 0.7041666666666666 | 12.257 |
| 0.7048611111111112 | 12.257 |
| 0.7055555555555556 | 12.257 |
| 0.7062499999999999 | 12.257 |
| 0.7069444444444444 | 12.257 |
| 0.7076388888888889 | 12.257 |
| 0.7083333333333334 | 12.257 |
| 0.7090277777777777 | 12.257 |
| 0.7097222222222223 | 12.257 |
| 0.7104166666666667 | 12.257 |
| 0.7111111111111111 | 12.257 |
| 0.7118055555555555 | 12.257 |
| 0.7125 | 12.257 |
| 0.7131944444444445 | 12.257 |
| 0.7138888888888889 | 7.887 |
| 0.7145833333333332 | 7.887 |
| 0.7152777777777778 | 7.887 |
| 0.7159722222222222 | 7.887 |
| 0.7166666666666667 | 7.887 |
| 0.717361111111111 | 7.887 |
| 0.7180555555555556 | 7.887 |
| 0.71875 | 7.887 |
| 0.7194444444444444 | 7.887 |
| 0.720138888888889 | 7.887 |
| 0.7208333333333333 | 7.887 |
| 0.7215277777777778 | 7.887 |
| 0.7222222222222222 | 7.887 |
| 0.7229166666666668 | 3.525 |
| 0.7236111111111111 | 7.887 |
| 0.7243055555555555 | 3.525 |
| 0.725 | 3.525 |
| 0.7256944444444445 | 3.525 |
| 0.7263888888888889 | 3.525 |
| 0.7270833333333333 | 3.525 |
| 0.7277777777777777 | 3.525 |
| 0.7284722222222223 | 3.525 |
| 0.7291666666666666 | 3.525 |
| 0.7298611111111111 | 3.525 |
| 0.7305555555555556 | 3.525 |
| 0.7312500000000001 | 3.525 |
| 0.7319444444444444 | 3.525 |
| 0.7326388888888888 | 3.525 |
| 0.7333333333333334 | 3.525 |
| 0.7340277777777778 | 3.525 |
| 0.7347222222222222 | 3.525 |
| 0.7354166666666666 | 3.525 |
| 0.7361111111111112 | 3.525 |
| 0.7368055555555556 | 3.525 |
| 0.7374999999999999 | 3.525 |
| 0.7381944444444444 | 3.525 |
| 0.7388888888888889 | 3.525 |
| 0.7395833333333334 | 3.525 |
| 0.7402777777777777 | 3.525 |
| 0.7409722222222223 | 3.525 |
| 0.7416666666666667 | 3.525 |
| 0.7423611111111111 | 3.525 |
| 0.7430555555555555 | 0 |
| 0.74375 | 3.525 |
| 0.7444444444444445 | 0 |
| 0.7451388888888889 | 0 |
| 0.7458333333333332 | 0 |
| 0.7465277777777778 | 0 |
| 0.7472222222222222 | 0 |
| 0.7479166666666667 | 0 |
| 0.748611111111111 | 0 |
| 0.7493055555555556 | 0 |
| 0.75 | 0 |
| 0.7506944444444444 | 0 |
| 0.751388888888889 | 0 |
| 0.7520833333333333 | 0 |
| 0.7527777777777778 | 0 |
| 0.7534722222222222 | 0 |
| 0.7541666666666668 | 0 |
| 0.7548611111111111 | 0 |
| 0.7555555555555555 | 0 |
| 0.75625 | 0 |
| 0.7569444444444445 | 0 |
| 0.7576388888888889 | 0 |
| 0.7583333333333333 | 0 |
| 0.7590277777777777 | 0 |
| 0.7597222222222223 | 0 |
| 0.7604166666666666 | 0 |
| 0.7611111111111111 | 0 |
| 0.7618055555555556 | 0 |
| 0.7625000000000001 | 0 |
| 0.7631944444444444 | 0 |
| 0.7638888888888888 | 0 |
| 0.7645833333333334 | 0 |
| 0.7652777777777778 | 0 |
| 0.7659722222222222 | 0 |
| 0.7666666666666666 | 0 |
| 0.7673611111111112 | 0 |
| 0.7680555555555556 | 0 |
| 0.7687499999999999 | 0 |
| 0.7694444444444444 | 0 |
| 0.7701388888888889 | 0 |
| 0.7708333333333334 | 0 |
| 0.7715277777777777 | 0 |
| 0.7722222222222223 | 0 |
| 0.7729166666666667 | 0 |
| 0.7736111111111111 | 0 |
| 0.7743055555555555 | 0 |
| 0.775 | 0 |
| 0.7756944444444445 | 0 |
| 0.7763888888888889 | 0 |
| 0.7770833333333332 | 0 |
| 0.7777777777777778 | 0 |
| 0.7784722222222222 | 0 |
| 0.7791666666666667 | 0 |
| 0.779861111111111 | 0 |
| 0.7805555555555556 | 0 |
| 0.78125 | 0 |
| 0.7819444444444444 | 0 |
| 0.782638888888889 | 0 |
| 0.7833333333333333 | 0 |
| 0.7840277777777778 | 0 |
| 0.7847222222222222 | 0 |
| 0.7854166666666668 | 0 |
| 0.7861111111111111 | 0 |
| 0.7868055555555555 | 0 |
| 0.7875 | 0 |
| 0.7881944444444445 | 0 |
| 0.7888888888888889 | 0 |
| 0.7895833333333333 | 0 |
| 0.7902777777777777 | 0 |
| 0.7909722222222223 | 0 |
| 0.7916666666666666 | 0 |
| 0.7923611111111111 | 0 |
| 0.7930555555555556 | 0 |
| 0.7937500000000001 | 0 |
| 0.7944444444444444 | 0 |
| 0.7951388888888888 | 0 |
| 0.7958333333333334 | 0 |
| 0.7965277777777778 | 0 |
| 0.7972222222222222 | 0 |
| 0.7979166666666666 | 0 |
| 0.7986111111111112 | 0 |
| 0.7993055555555556 | 0 |
| 0.7999999999999999 | 0 |
| 0.8006944444444444 | 0 |
| 0.8013888888888889 | 0 |
| 0.8020833333333334 | 0 |
| 0.8027777777777777 | 0 |
| 0.8034722222222223 | 0 |
| 0.8041666666666667 | 0 |
| 0.8048611111111111 | 0 |
| 0.8055555555555555 | 0 |
| 0.80625 | 0 |
| 0.8069444444444445 | 0 |
| 0.8076388888888889 | 0 |
| 0.8083333333333332 | 0 |
| 0.8090277777777778 | 0 |
| 0.8097222222222222 | 0 |
| 0.8104166666666667 | 0 |
| 0.811111111111111 | 0 |
| 0.8118055555555556 | 0 |
| 0.8125 | 0 |
| 0.8131944444444444 | 0 |
| 0.813888888888889 | 0 |
| 0.8145833333333333 | 0 |
| 0.8152777777777778 | 0 |
| 0.8159722222222222 | 0 |
| 0.8166666666666668 | 0 |
| 0.8173611111111111 | 0 |
| 0.8180555555555555 | 0 |
| 0.81875 | 0 |
| 0.8194444444444445 | 0 |
| 0.8201388888888889 | 0 |
| 0.8208333333333333 | 0 |
| 0.8215277777777777 | 0 |
| 0.8222222222222223 | 0 |
| 0.8229166666666666 | 0 |
| 0.8236111111111111 | 0 |
| 0.8243055555555556 | 0 |
| 0.8250000000000001 | 0 |
| 0.8256944444444444 | 0 |
| 0.8263888888888888 | 0 |
| 0.8270833333333334 | 0 |
| 0.8277777777777778 | 0 |
| 0.8284722222222222 | 0 |
| 0.8291666666666666 | 0 |
| 0.8298611111111112 | 0 |
| 0.8305555555555556 | 0 |
| 0.8312499999999999 | 0 |
| 0.8319444444444444 | 0 |
| 0.8326388888888889 | 0 |
| 0.8333333333333334 | 0 |
| 0.8340277777777777 | 0 |
| 0.8347222222222223 | 0 |
| 0.8354166666666667 | 0 |
| 0.8361111111111111 | 0 |
| 0.8368055555555555 | 0 |
| 0.8375 | 0 |
| 0.8381944444444445 | 0 |
| 0.8388888888888889 | 0 |
| 0.8395833333333332 | 0 |
| 0.8402777777777778 | 0 |
| 0.8409722222222222 | 0 |
| 0.8416666666666667 | 0 |
| 0.842361111111111 | 0 |
| 0.8430555555555556 | 0 |
| 0.84375 | 0 |
| 0.8444444444444444 | 0 |
| 0.845138888888889 | 0 |
| 0.8458333333333333 | 0 |
| 0.8465277777777778 | 0 |
| 0.8472222222222222 | 0 |
| 0.8479166666666668 | 0 |
| 0.8486111111111111 | 0 |
| 0.8493055555555555 | 0 |
| 0.85 | 0 |
| 0.8506944444444445 | 0 |
| 0.8513888888888889 | 0 |
| 0.8520833333333333 | 0 |
| 0.8527777777777777 | 0 |
| 0.8534722222222223 | 0 |
| 0.8541666666666666 | 0 |
| 0.8548611111111111 | 0 |
| 0.8555555555555556 | 0 |
| 0.8562500000000001 | 0 |
| 0.8569444444444444 | 0 |
| 0.8576388888888888 | 0 |
| 0.8583333333333334 | 0 |
| 0.8590277777777778 | 0 |
| 0.8597222222222222 | 0 |
| 0.8604166666666666 | 0 |
| 0.8611111111111112 | 0 |
| 0.8618055555555556 | 0 |
| 0.8624999999999999 | 0 |
| 0.8631944444444444 | 0 |
| 0.8638888888888889 | 0 |
| 0.8645833333333334 | 0 |
| 0.8652777777777777 | 0 |
| 0.8659722222222223 | 0 |
| 0.8666666666666667 | 0 |
| 0.8673611111111111 | 0 |
| 0.8680555555555555 | 0 |
| 0.86875 | 0 |
| 0.8694444444444445 | 0 |
| 0.8701388888888889 | 0 |
| 0.8708333333333332 | 0 |
| 0.8715277777777778 | 0 |
| 0.8722222222222222 | 0 |
| 0.8729166666666667 | 0 |
| 0.873611111111111 | 0 |
| 0.8743055555555556 | 0 |
| 0.875 | 0 |
| 0.8756944444444444 | 0 |
| 0.876388888888889 | 0 |
| 0.8770833333333333 | 0 |
| 0.8777777777777778 | 0 |
| 0.8784722222222222 | 0 |
| 0.8791666666666668 | 0 |
| 0.8798611111111111 | 0 |
| 0.8805555555555555 | 0 |
| 0.88125 | 0 |
| 0.8819444444444445 | 0 |
| 0.8826388888888889 | 0 |
| 0.8833333333333333 | 0 |
| 0.8840277777777777 | 0 |
| 0.8847222222222223 | 0 |
| 0.8854166666666666 | 0 |
| 0.8861111111111111 | 0 |
| 0.8868055555555556 | 0 |
| 0.8875000000000001 | 0 |
| 0.8881944444444444 | 0 |
| 0.8888888888888888 | 0 |
| 0.8895833333333334 | 0 |
| 0.8902777777777778 | 0 |
| 0.8909722222222222 | 0 |
| 0.8916666666666666 | 0 |
| 0.8923611111111112 | 0 |
| 0.8930555555555556 | 0 |
| 0.8937499999999999 | 0 |
| 0.8944444444444444 | 0 |
| 0.8951388888888889 | 0 |
| 0.8958333333333334 | 0 |
| 0.8965277777777777 | 0 |
| 0.8972222222222223 | 0 |
| 0.8979166666666667 | 0 |
| 0.8986111111111111 | 0 |
| 0.8993055555555555 | 0 |
| 0.9 | 0 |
| 0.9006944444444445 | 0 |
| 0.9013888888888889 | 0 |
| 0.9020833333333332 | 0 |
| 0.9027777777777778 | 0 |
| 0.9034722222222222 | 0 |
| 0.9041666666666667 | 0 |
| 0.904861111111111 | 0 |
| 0.9055555555555556 | 0 |
| 0.90625 | 0 |
| 0.9069444444444444 | 0 |
| 0.907638888888889 | 0 |
| 0.9083333333333333 | 0 |
| 0.9090277777777778 | 0 |
| 0.9097222222222222 | 0 |
| 0.9104166666666668 | 0 |
| 0.9111111111111111 | 0 |
| 0.9118055555555555 | 0 |
| 0.9125 | 0 |
| 0.9131944444444445 | 0 |
| 0.9138888888888889 | 0 |
| 0.9145833333333333 | 0 |
| 0.9152777777777777 | 0 |
| 0.9159722222222223 | 0 |
| 0.9166666666666666 | 0 |
| 0.9173611111111111 | 0 |
| 0.9180555555555556 | 0 |
| 0.9187500000000001 | 0 |
| 0.9194444444444444 | 0 |
| 0.9201388888888888 | 0 |
| 0.9208333333333334 | 0 |
| 0.9215277777777778 | 0 |
| 0.9222222222222222 | 0 |
| 0.9229166666666666 | 0 |
| 0.9236111111111112 | 0 |
| 0.9243055555555556 | 0 |
| 0.9249999999999999 | 0 |
| 0.9256944444444444 | 0 |
| 0.9263888888888889 | 0 |
| 0.9270833333333334 | 0 |
| 0.9277777777777777 | 0 |
| 0.9284722222222223 | 0 |
| 0.9291666666666667 | 0 |
| 0.9298611111111111 | 0 |
| 0.9305555555555555 | 0 |
| 0.93125 | 0 |
| 0.9319444444444445 | 0 |
| 0.9326388888888889 | 0 |
| 0.9333333333333332 | 0 |
| 0.9340277777777778 | 0 |
| 0.9347222222222222 | 0 |
| 0.9354166666666667 | 0 |
| 0.936111111111111 | 0 |
| 0.9368055555555556 | 0 |
| 0.9375 | 0 |
| 0.9381944444444444 | 0 |
| 0.938888888888889 | 0 |
| 0.9395833333333333 | 0 |
| 0.9402777777777778 | 0 |
| 0.9409722222222222 | 0 |
| 0.9416666666666668 | 0 |
| 0.9423611111111111 | 0 |
| 0.9430555555555555 | 0 |
| 0.94375 | 0 |
| 0.9444444444444445 | 0 |
| 0.9451388888888889 | 0 |
| 0.9458333333333333 | 0 |
| 0.9465277777777777 | 0 |
| 0.9472222222222223 | 0 |
| 0.9479166666666666 | 0 |
| 0.9486111111111111 | 0 |
| 0.9493055555555556 | 0 |
| 0.9500000000000001 | 0 |
| 0.9506944444444444 | 0 |
| 0.9513888888888888 | 0 |
| 0.9520833333333334 | 0 |
| 0.9527777777777778 | 0 |
| 0.9534722222222222 | 0 |
| 0.9541666666666666 | 0 |
| 0.9548611111111112 | 0 |
| 0.9555555555555556 | 0 |
| 0.9562499999999999 | 0 |
| 0.9569444444444444 | 0 |
| 0.9576388888888889 | 0 |
| 0.9583333333333334 | 0 |
| 0.9590277777777777 | 0 |
| 0.9597222222222223 | 0 |
| 0.9604166666666667 | 0 |
| 0.9611111111111111 | 0 |
| 0.9618055555555555 | 0 |
| 0.9625 | 0 |
| 0.9631944444444445 | 0 |
| 0.9638888888888889 | 0 |
| 0.9645833333333332 | 0 |
| 0.9652777777777778 | 0 |
| 0.9659722222222222 | 0 |
| 0.9666666666666667 | 0 |
| 0.967361111111111 | 0 |
| 0.9680555555555556 | 0 |
| 0.96875 | 0 |
| 0.9694444444444444 | 0 |
| 0.970138888888889 | 0 |
| 0.9708333333333333 | 0 |
| 0.9715277777777778 | 0 |
| 0.9722222222222222 | 0 |
| 0.9729166666666668 | 0 |
| 0.9736111111111111 | 0 |
| 0.9743055555555555 | 0 |
| 0.975 | 0 |
| 0.9756944444444445 | 0 |
| 0.9763888888888889 | 0 |
| 0.9770833333333333 | 0 |
| 0.9777777777777777 | 0 |
| 0.9784722222222223 | 0 |
| 0.9791666666666666 | 0 |
| 0.9798611111111111 | 0 |
| 0.9805555555555556 | 0 |
| 0.9812500000000001 | 0 |
| 0.9819444444444444 | 0 |
| 0.9826388888888888 | 0 |
| 0.9833333333333334 | 0 |
| 0.9840277777777778 | 0 |
| 0.9847222222222222 | 0 |
| 0.9854166666666666 | 0 |
| 0.9861111111111112 | 0 |
| 0.9868055555555556 | 0 |
| 0.9874999999999999 | 0 |
| 0.9881944444444444 | 0 |
| 0.9888888888888889 | 0 |
| 0.9895833333333334 | 0 |
| 0.9902777777777777 | 0 |
| 0.9909722222222223 | 0 |
| 0.9916666666666667 | 0 |
| 0.9923611111111111 | 0 |
| 0.9930555555555555 | 0 |
| 0.99375 | 0 |
| 0.9944444444444445 | 0 |
| 0.9951388888888889 | 0 |
| 0.9958333333333332 | 0 |
| 0.9965277777777778 | 0 |
| 0.9972222222222222 | 0 |
| 0.9979166666666667 | 0 |
| 0.998611111111111 | 0 |
| 0.9993055555555556 | 0 |